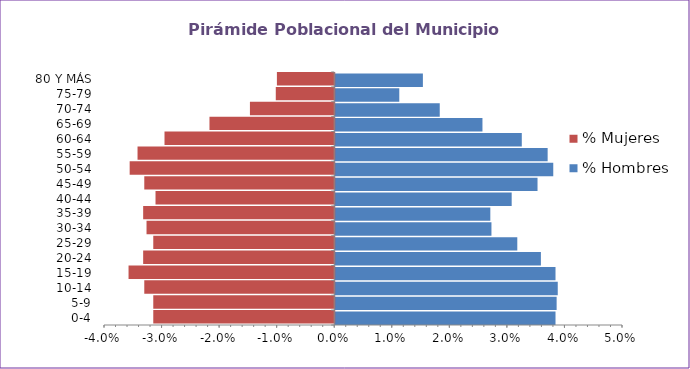
| Category | % Hombres | % Mujeres |
|---|---|---|
| 0-4 | 0.038 | -0.031 |
| 5-9 | 0.038 | -0.031 |
| 10-14 | 0.039 | -0.033 |
| 15-19 | 0.038 | -0.036 |
| 20-24 | 0.036 | -0.033 |
| 25-29 | 0.032 | -0.031 |
| 30-34 | 0.027 | -0.033 |
| 35-39 | 0.027 | -0.033 |
| 40-44 | 0.031 | -0.031 |
| 45-49 | 0.035 | -0.033 |
| 50-54 | 0.038 | -0.036 |
| 55-59 | 0.037 | -0.034 |
| 60-64 | 0.032 | -0.029 |
| 65-69 | 0.026 | -0.022 |
| 70-74 | 0.018 | -0.015 |
| 75-79 | 0.011 | -0.01 |
| 80 Y MÁS | 0.015 | -0.01 |